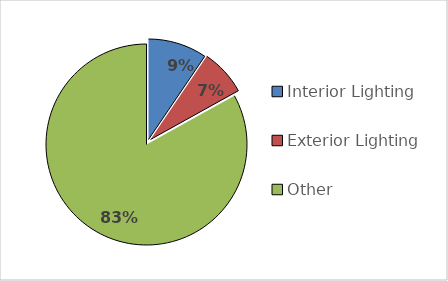
| Category | Series 0 |
|---|---|
| Interior Lighting | 9464 |
| Exterior Lighting | 7469.28 |
| Other | 83066.72 |